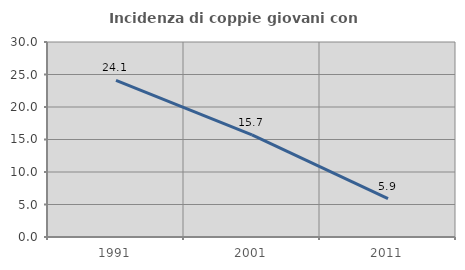
| Category | Incidenza di coppie giovani con figli |
|---|---|
| 1991.0 | 24.11 |
| 2001.0 | 15.726 |
| 2011.0 | 5.911 |